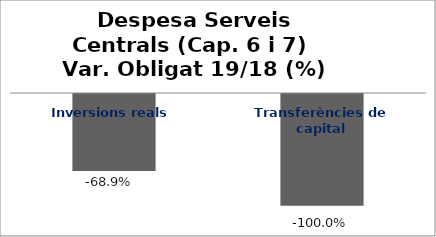
| Category | Series 0 |
|---|---|
| Inversions reals | -0.689 |
| Transferències de capital | -1 |